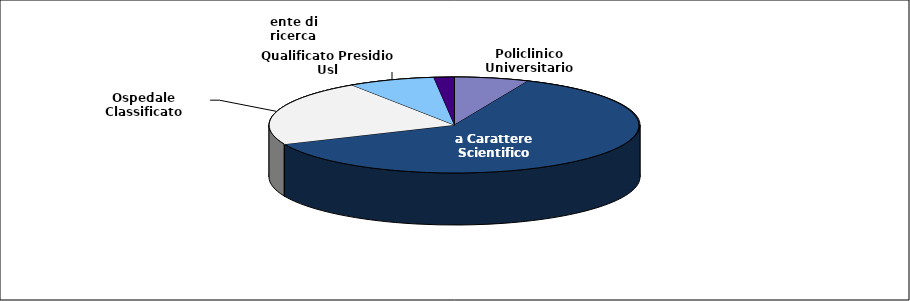
| Category | Personale |
|---|---|
| Policlinico Universitario | 4924 |
| a Carattere Scientifico | 46940 |
| Ospedale Classificato | 16816 |
| Qualificato Presidio Usl | 5703 |
| ente di ricerca | 1354 |